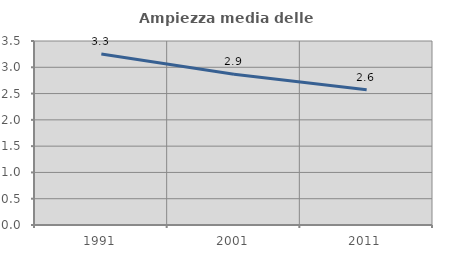
| Category | Ampiezza media delle famiglie |
|---|---|
| 1991.0 | 3.251 |
| 2001.0 | 2.867 |
| 2011.0 | 2.571 |